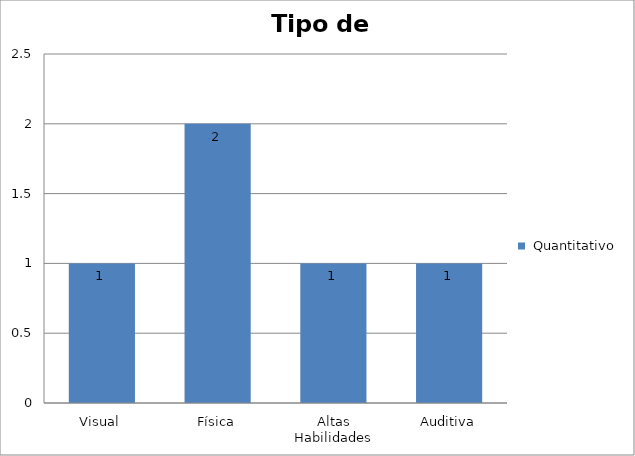
| Category |  Quantitativo |
|---|---|
| Visual | 1 |
| Física | 2 |
| Altas Habilidades | 1 |
| Auditiva | 1 |